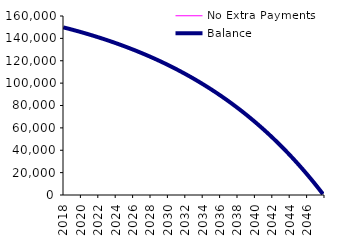
| Category | No Extra Payments | Balance |
|---|---|---|
| 2018-01-01 | 149835.82 | 149835.82 |
| 2018-02-01 | 149670.89 | 149670.89 |
| 2018-03-01 | 149505.2 | 149505.2 |
| 2018-04-01 | 149338.75 | 149338.75 |
| 2018-05-01 | 149171.54 | 149171.54 |
| 2018-06-01 | 149003.56 | 149003.56 |
| 2018-07-01 | 148834.81 | 148834.81 |
| 2018-08-01 | 148665.29 | 148665.29 |
| 2018-09-01 | 148494.99 | 148494.99 |
| 2018-10-01 | 148323.91 | 148323.91 |
| 2018-11-01 | 148152.05 | 148152.05 |
| 2018-12-01 | 147979.4 | 147979.4 |
| 2019-01-01 | 147805.96 | 147805.96 |
| 2019-02-01 | 147631.72 | 147631.72 |
| 2019-03-01 | 147456.69 | 147456.69 |
| 2019-04-01 | 147280.85 | 147280.85 |
| 2019-05-01 | 147104.21 | 147104.21 |
| 2019-06-01 | 146926.76 | 146926.76 |
| 2019-07-01 | 146748.49 | 146748.49 |
| 2019-08-01 | 146569.41 | 146569.41 |
| 2019-09-01 | 146389.51 | 146389.51 |
| 2019-10-01 | 146208.78 | 146208.78 |
| 2019-11-01 | 146027.22 | 146027.22 |
| 2019-12-01 | 145844.83 | 145844.83 |
| 2020-01-01 | 145661.61 | 145661.61 |
| 2020-02-01 | 145477.55 | 145477.55 |
| 2020-03-01 | 145292.64 | 145292.64 |
| 2020-04-01 | 145106.88 | 145106.88 |
| 2020-05-01 | 144920.27 | 144920.27 |
| 2020-06-01 | 144732.81 | 144732.81 |
| 2020-07-01 | 144544.49 | 144544.49 |
| 2020-08-01 | 144355.31 | 144355.31 |
| 2020-09-01 | 144165.26 | 144165.26 |
| 2020-10-01 | 143974.34 | 143974.34 |
| 2020-11-01 | 143782.54 | 143782.54 |
| 2020-12-01 | 143589.86 | 143589.86 |
| 2021-01-01 | 143396.3 | 143396.3 |
| 2021-02-01 | 143201.85 | 143201.85 |
| 2021-03-01 | 143006.51 | 143006.51 |
| 2021-04-01 | 142810.28 | 142810.28 |
| 2021-05-01 | 142613.15 | 142613.15 |
| 2021-06-01 | 142415.11 | 142415.11 |
| 2021-07-01 | 142216.17 | 142216.17 |
| 2021-08-01 | 142016.31 | 142016.31 |
| 2021-09-01 | 141815.54 | 141815.54 |
| 2021-10-01 | 141613.85 | 141613.85 |
| 2021-11-01 | 141411.23 | 141411.23 |
| 2021-12-01 | 141207.68 | 141207.68 |
| 2022-01-01 | 141003.2 | 141003.2 |
| 2022-02-01 | 140797.78 | 140797.78 |
| 2022-03-01 | 140591.42 | 140591.42 |
| 2022-04-01 | 140384.12 | 140384.12 |
| 2022-05-01 | 140175.87 | 140175.87 |
| 2022-06-01 | 139966.66 | 139966.66 |
| 2022-07-01 | 139756.49 | 139756.49 |
| 2022-08-01 | 139545.36 | 139545.36 |
| 2022-09-01 | 139333.26 | 139333.26 |
| 2022-10-01 | 139120.19 | 139120.19 |
| 2022-11-01 | 138906.14 | 138906.14 |
| 2022-12-01 | 138691.11 | 138691.11 |
| 2023-01-01 | 138475.1 | 138475.1 |
| 2023-02-01 | 138258.1 | 138258.1 |
| 2023-03-01 | 138040.1 | 138040.1 |
| 2023-04-01 | 137821.1 | 137821.1 |
| 2023-05-01 | 137601.1 | 137601.1 |
| 2023-06-01 | 137380.09 | 137380.09 |
| 2023-07-01 | 137158.07 | 137158.07 |
| 2023-08-01 | 136935.03 | 136935.03 |
| 2023-09-01 | 136710.97 | 136710.97 |
| 2023-10-01 | 136485.88 | 136485.88 |
| 2023-11-01 | 136259.76 | 136259.76 |
| 2023-12-01 | 136032.6 | 136032.6 |
| 2024-01-01 | 135804.4 | 135804.4 |
| 2024-02-01 | 135575.16 | 135575.16 |
| 2024-03-01 | 135344.87 | 135344.87 |
| 2024-04-01 | 135113.52 | 135113.52 |
| 2024-05-01 | 134881.11 | 134881.11 |
| 2024-06-01 | 134647.64 | 134647.64 |
| 2024-07-01 | 134413.1 | 134413.1 |
| 2024-08-01 | 134177.48 | 134177.48 |
| 2024-09-01 | 133940.78 | 133940.78 |
| 2024-10-01 | 133703 | 133703 |
| 2024-11-01 | 133464.13 | 133464.13 |
| 2024-12-01 | 133224.16 | 133224.16 |
| 2025-01-01 | 132983.09 | 132983.09 |
| 2025-02-01 | 132740.92 | 132740.92 |
| 2025-03-01 | 132497.64 | 132497.64 |
| 2025-04-01 | 132253.24 | 132253.24 |
| 2025-05-01 | 132007.72 | 132007.72 |
| 2025-06-01 | 131761.08 | 131761.08 |
| 2025-07-01 | 131513.3 | 131513.3 |
| 2025-08-01 | 131264.39 | 131264.39 |
| 2025-09-01 | 131014.34 | 131014.34 |
| 2025-10-01 | 130763.14 | 130763.14 |
| 2025-11-01 | 130510.79 | 130510.79 |
| 2025-12-01 | 130257.28 | 130257.28 |
| 2026-01-01 | 130002.61 | 130002.61 |
| 2026-02-01 | 129746.78 | 129746.78 |
| 2026-03-01 | 129489.77 | 129489.77 |
| 2026-04-01 | 129231.58 | 129231.58 |
| 2026-05-01 | 128972.21 | 128972.21 |
| 2026-06-01 | 128711.65 | 128711.65 |
| 2026-07-01 | 128449.9 | 128449.9 |
| 2026-08-01 | 128186.95 | 128186.95 |
| 2026-09-01 | 127922.79 | 127922.79 |
| 2026-10-01 | 127657.42 | 127657.42 |
| 2026-11-01 | 127390.84 | 127390.84 |
| 2026-12-01 | 127123.03 | 127123.03 |
| 2027-01-01 | 126854 | 126854 |
| 2027-02-01 | 126583.73 | 126583.73 |
| 2027-03-01 | 126312.23 | 126312.23 |
| 2027-04-01 | 126039.48 | 126039.48 |
| 2027-05-01 | 125765.48 | 125765.48 |
| 2027-06-01 | 125490.23 | 125490.23 |
| 2027-07-01 | 125213.71 | 125213.71 |
| 2027-08-01 | 124935.93 | 124935.93 |
| 2027-09-01 | 124656.87 | 124656.87 |
| 2027-10-01 | 124376.53 | 124376.53 |
| 2027-11-01 | 124094.91 | 124094.91 |
| 2027-12-01 | 123812 | 123812 |
| 2028-01-01 | 123527.79 | 123527.79 |
| 2028-02-01 | 123242.28 | 123242.28 |
| 2028-03-01 | 122955.46 | 122955.46 |
| 2028-04-01 | 122667.33 | 122667.33 |
| 2028-05-01 | 122377.88 | 122377.88 |
| 2028-06-01 | 122087.1 | 122087.1 |
| 2028-07-01 | 121794.99 | 121794.99 |
| 2028-08-01 | 121501.54 | 121501.54 |
| 2028-09-01 | 121206.74 | 121206.74 |
| 2028-10-01 | 120910.59 | 120910.59 |
| 2028-11-01 | 120613.08 | 120613.08 |
| 2028-12-01 | 120314.21 | 120314.21 |
| 2029-01-01 | 120013.97 | 120013.97 |
| 2029-02-01 | 119712.35 | 119712.35 |
| 2029-03-01 | 119409.35 | 119409.35 |
| 2029-04-01 | 119104.96 | 119104.96 |
| 2029-05-01 | 118799.18 | 118799.18 |
| 2029-06-01 | 118492 | 118492 |
| 2029-07-01 | 118183.41 | 118183.41 |
| 2029-08-01 | 117873.4 | 117873.4 |
| 2029-09-01 | 117561.97 | 117561.97 |
| 2029-10-01 | 117249.12 | 117249.12 |
| 2029-11-01 | 116934.83 | 116934.83 |
| 2029-12-01 | 116619.1 | 116619.1 |
| 2030-01-01 | 116301.92 | 116301.92 |
| 2030-02-01 | 115983.29 | 115983.29 |
| 2030-03-01 | 115663.2 | 115663.2 |
| 2030-04-01 | 115341.64 | 115341.64 |
| 2030-05-01 | 115018.61 | 115018.61 |
| 2030-06-01 | 114694.1 | 114694.1 |
| 2030-07-01 | 114368.1 | 114368.1 |
| 2030-08-01 | 114040.61 | 114040.61 |
| 2030-09-01 | 113711.62 | 113711.62 |
| 2030-10-01 | 113381.12 | 113381.12 |
| 2030-11-01 | 113049.1 | 113049.1 |
| 2030-12-01 | 112715.56 | 112715.56 |
| 2031-01-01 | 112380.49 | 112380.49 |
| 2031-02-01 | 112043.89 | 112043.89 |
| 2031-03-01 | 111705.74 | 111705.74 |
| 2031-04-01 | 111366.04 | 111366.04 |
| 2031-05-01 | 111024.79 | 111024.79 |
| 2031-06-01 | 110681.97 | 110681.97 |
| 2031-07-01 | 110337.58 | 110337.58 |
| 2031-08-01 | 109991.61 | 109991.61 |
| 2031-09-01 | 109644.06 | 109644.06 |
| 2031-10-01 | 109294.92 | 109294.92 |
| 2031-11-01 | 108944.18 | 108944.18 |
| 2031-12-01 | 108591.83 | 108591.83 |
| 2032-01-01 | 108237.86 | 108237.86 |
| 2032-02-01 | 107882.27 | 107882.27 |
| 2032-03-01 | 107525.05 | 107525.05 |
| 2032-04-01 | 107166.19 | 107166.19 |
| 2032-05-01 | 106805.69 | 106805.69 |
| 2032-06-01 | 106443.54 | 106443.54 |
| 2032-07-01 | 106079.73 | 106079.73 |
| 2032-08-01 | 105714.25 | 105714.25 |
| 2032-09-01 | 105347.09 | 105347.09 |
| 2032-10-01 | 104978.25 | 104978.25 |
| 2032-11-01 | 104607.72 | 104607.72 |
| 2032-12-01 | 104235.49 | 104235.49 |
| 2033-01-01 | 103861.56 | 103861.56 |
| 2033-02-01 | 103485.91 | 103485.91 |
| 2033-03-01 | 103108.54 | 103108.54 |
| 2033-04-01 | 102729.44 | 102729.44 |
| 2033-05-01 | 102348.6 | 102348.6 |
| 2033-06-01 | 101966.02 | 101966.02 |
| 2033-07-01 | 101581.68 | 101581.68 |
| 2033-08-01 | 101195.58 | 101195.58 |
| 2033-09-01 | 100807.71 | 100807.71 |
| 2033-10-01 | 100418.07 | 100418.07 |
| 2033-11-01 | 100026.64 | 100026.64 |
| 2033-12-01 | 99633.42 | 99633.42 |
| 2034-01-01 | 99238.39 | 99238.39 |
| 2034-02-01 | 98841.55 | 98841.55 |
| 2034-03-01 | 98442.89 | 98442.89 |
| 2034-04-01 | 98042.41 | 98042.41 |
| 2034-05-01 | 97640.09 | 97640.09 |
| 2034-06-01 | 97235.93 | 97235.93 |
| 2034-07-01 | 96829.91 | 96829.91 |
| 2034-08-01 | 96422.03 | 96422.03 |
| 2034-09-01 | 96012.28 | 96012.28 |
| 2034-10-01 | 95600.66 | 95600.66 |
| 2034-11-01 | 95187.15 | 95187.15 |
| 2034-12-01 | 94771.74 | 94771.74 |
| 2035-01-01 | 94354.43 | 94354.43 |
| 2035-02-01 | 93935.21 | 93935.21 |
| 2035-03-01 | 93514.07 | 93514.07 |
| 2035-04-01 | 93091 | 93091 |
| 2035-05-01 | 92665.99 | 92665.99 |
| 2035-06-01 | 92239.03 | 92239.03 |
| 2035-07-01 | 91810.11 | 91810.11 |
| 2035-08-01 | 91379.23 | 91379.23 |
| 2035-09-01 | 90946.37 | 90946.37 |
| 2035-10-01 | 90511.53 | 90511.53 |
| 2035-11-01 | 90074.69 | 90074.69 |
| 2035-12-01 | 89635.85 | 89635.85 |
| 2036-01-01 | 89195 | 89195 |
| 2036-02-01 | 88752.13 | 88752.13 |
| 2036-03-01 | 88307.23 | 88307.23 |
| 2036-04-01 | 87860.29 | 87860.29 |
| 2036-05-01 | 87411.3 | 87411.3 |
| 2036-06-01 | 86960.26 | 86960.26 |
| 2036-07-01 | 86507.15 | 86507.15 |
| 2036-08-01 | 86051.96 | 86051.96 |
| 2036-09-01 | 85594.68 | 85594.68 |
| 2036-10-01 | 85135.31 | 85135.31 |
| 2036-11-01 | 84673.83 | 84673.83 |
| 2036-12-01 | 84210.24 | 84210.24 |
| 2037-01-01 | 83744.52 | 83744.52 |
| 2037-02-01 | 83276.67 | 83276.67 |
| 2037-03-01 | 82806.67 | 82806.67 |
| 2037-04-01 | 82334.52 | 82334.52 |
| 2037-05-01 | 81860.21 | 81860.21 |
| 2037-06-01 | 81383.72 | 81383.72 |
| 2037-07-01 | 80905.05 | 80905.05 |
| 2037-08-01 | 80424.18 | 80424.18 |
| 2037-09-01 | 79941.11 | 79941.11 |
| 2037-10-01 | 79455.83 | 79455.83 |
| 2037-11-01 | 78968.32 | 78968.32 |
| 2037-12-01 | 78478.58 | 78478.58 |
| 2038-01-01 | 77986.59 | 77986.59 |
| 2038-02-01 | 77492.35 | 77492.35 |
| 2038-03-01 | 76995.84 | 76995.84 |
| 2038-04-01 | 76497.06 | 76497.06 |
| 2038-05-01 | 75995.99 | 75995.99 |
| 2038-06-01 | 75492.62 | 75492.62 |
| 2038-07-01 | 74986.95 | 74986.95 |
| 2038-08-01 | 74478.96 | 74478.96 |
| 2038-09-01 | 73968.64 | 73968.64 |
| 2038-10-01 | 73455.98 | 73455.98 |
| 2038-11-01 | 72940.97 | 72940.97 |
| 2038-12-01 | 72423.6 | 72423.6 |
| 2039-01-01 | 71903.86 | 71903.86 |
| 2039-02-01 | 71381.74 | 71381.74 |
| 2039-03-01 | 70857.23 | 70857.23 |
| 2039-04-01 | 70330.31 | 70330.31 |
| 2039-05-01 | 69800.98 | 69800.98 |
| 2039-06-01 | 69269.22 | 69269.22 |
| 2039-07-01 | 68735.02 | 68735.02 |
| 2039-08-01 | 68198.38 | 68198.38 |
| 2039-09-01 | 67659.28 | 67659.28 |
| 2039-10-01 | 67117.71 | 67117.71 |
| 2039-11-01 | 66573.65 | 66573.65 |
| 2039-12-01 | 66027.1 | 66027.1 |
| 2040-01-01 | 65478.04 | 65478.04 |
| 2040-02-01 | 64926.47 | 64926.47 |
| 2040-03-01 | 64372.37 | 64372.37 |
| 2040-04-01 | 63815.73 | 63815.73 |
| 2040-05-01 | 63256.54 | 63256.54 |
| 2040-06-01 | 62694.79 | 62694.79 |
| 2040-07-01 | 62130.46 | 62130.46 |
| 2040-08-01 | 61563.54 | 61563.54 |
| 2040-09-01 | 60994.03 | 60994.03 |
| 2040-10-01 | 60421.91 | 60421.91 |
| 2040-11-01 | 59847.16 | 59847.16 |
| 2040-12-01 | 59269.78 | 59269.78 |
| 2041-01-01 | 58689.75 | 58689.75 |
| 2041-02-01 | 58107.06 | 58107.06 |
| 2041-03-01 | 57521.7 | 57521.7 |
| 2041-04-01 | 56933.66 | 56933.66 |
| 2041-05-01 | 56342.93 | 56342.93 |
| 2041-06-01 | 55749.49 | 55749.49 |
| 2041-07-01 | 55153.33 | 55153.33 |
| 2041-08-01 | 54554.44 | 54554.44 |
| 2041-09-01 | 53952.8 | 53952.8 |
| 2041-10-01 | 53348.4 | 53348.4 |
| 2041-11-01 | 52741.23 | 52741.23 |
| 2041-12-01 | 52131.28 | 52131.28 |
| 2042-01-01 | 51518.54 | 51518.54 |
| 2042-02-01 | 50902.99 | 50902.99 |
| 2042-03-01 | 50284.62 | 50284.62 |
| 2042-04-01 | 49663.41 | 49663.41 |
| 2042-05-01 | 49039.35 | 49039.35 |
| 2042-06-01 | 48412.43 | 48412.43 |
| 2042-07-01 | 47782.64 | 47782.64 |
| 2042-08-01 | 47149.96 | 47149.96 |
| 2042-09-01 | 46514.38 | 46514.38 |
| 2042-10-01 | 45875.89 | 45875.89 |
| 2042-11-01 | 45234.47 | 45234.47 |
| 2042-12-01 | 44590.11 | 44590.11 |
| 2043-01-01 | 43942.8 | 43942.8 |
| 2043-02-01 | 43292.52 | 43292.52 |
| 2043-03-01 | 42639.26 | 42639.26 |
| 2043-04-01 | 41983.01 | 41983.01 |
| 2043-05-01 | 41323.75 | 41323.75 |
| 2043-06-01 | 40661.47 | 40661.47 |
| 2043-07-01 | 39996.16 | 39996.16 |
| 2043-08-01 | 39327.8 | 39327.8 |
| 2043-09-01 | 38656.37 | 38656.37 |
| 2043-10-01 | 37981.87 | 37981.87 |
| 2043-11-01 | 37304.27 | 37304.27 |
| 2043-12-01 | 36623.57 | 36623.57 |
| 2044-01-01 | 35939.75 | 35939.75 |
| 2044-02-01 | 35252.79 | 35252.79 |
| 2044-03-01 | 34562.69 | 34562.69 |
| 2044-04-01 | 33869.42 | 33869.42 |
| 2044-05-01 | 33172.97 | 33172.97 |
| 2044-06-01 | 32473.33 | 32473.33 |
| 2044-07-01 | 31770.49 | 31770.49 |
| 2044-08-01 | 31064.42 | 31064.42 |
| 2044-09-01 | 30355.12 | 30355.12 |
| 2044-10-01 | 29642.57 | 29642.57 |
| 2044-11-01 | 28926.75 | 28926.75 |
| 2044-12-01 | 28207.65 | 28207.65 |
| 2045-01-01 | 27485.26 | 27485.26 |
| 2045-02-01 | 26759.55 | 26759.55 |
| 2045-03-01 | 26030.52 | 26030.52 |
| 2045-04-01 | 25298.15 | 25298.15 |
| 2045-05-01 | 24562.42 | 24562.42 |
| 2045-06-01 | 23823.32 | 23823.32 |
| 2045-07-01 | 23080.83 | 23080.83 |
| 2045-08-01 | 22334.94 | 22334.94 |
| 2045-09-01 | 21585.63 | 21585.63 |
| 2045-10-01 | 20832.88 | 20832.88 |
| 2045-11-01 | 20076.68 | 20076.68 |
| 2045-12-01 | 19317.02 | 19317.02 |
| 2046-01-01 | 18553.88 | 18553.88 |
| 2046-02-01 | 17787.24 | 17787.24 |
| 2046-03-01 | 17017.08 | 17017.08 |
| 2046-04-01 | 16243.39 | 16243.39 |
| 2046-05-01 | 15466.16 | 15466.16 |
| 2046-06-01 | 14685.37 | 14685.37 |
| 2046-07-01 | 13901 | 13901 |
| 2046-08-01 | 13113.03 | 13113.03 |
| 2046-09-01 | 12321.45 | 12321.45 |
| 2046-10-01 | 11526.24 | 11526.24 |
| 2046-11-01 | 10727.39 | 10727.39 |
| 2046-12-01 | 9924.88 | 9924.88 |
| 2047-01-01 | 9118.69 | 9118.69 |
| 2047-02-01 | 8308.8 | 8308.8 |
| 2047-03-01 | 7495.2 | 7495.2 |
| 2047-04-01 | 6677.87 | 6677.87 |
| 2047-05-01 | 5856.8 | 5856.8 |
| 2047-06-01 | 5031.96 | 5031.96 |
| 2047-07-01 | 4203.34 | 4203.34 |
| 2047-08-01 | 3370.93 | 3370.93 |
| 2047-09-01 | 2534.7 | 2534.7 |
| 2047-10-01 | 1694.64 | 1694.64 |
| 2047-11-01 | 850.73 | 850.73 |
| 2047-12-01 | 0 | 0 |